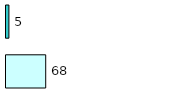
| Category | Series 0 | Series 1 |
|---|---|---|
| 0 | 68 | 5 |